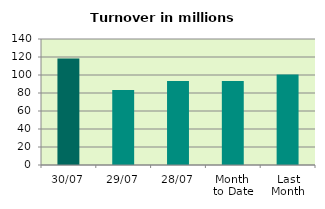
| Category | Series 0 |
|---|---|
| 30/07 | 118.205 |
| 29/07 | 83.425 |
| 28/07 | 93.459 |
| Month 
to Date | 93.279 |
| Last
Month | 100.537 |